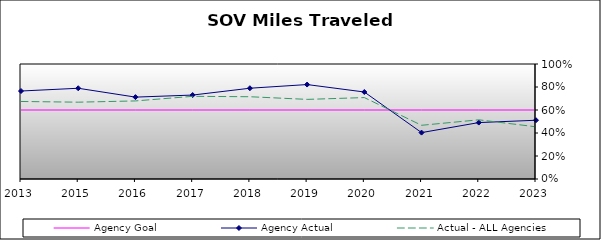
| Category | Agency Goal | Agency Actual | Actual - ALL Agencies |
|---|---|---|---|
| 2013.0 | 0.6 | 0.765 | 0.674 |
| 2015.0 | 0.6 | 0.789 | 0.668 |
| 2016.0 | 0.6 | 0.712 | 0.679 |
| 2017.0 | 0.6 | 0.73 | 0.719 |
| 2018.0 | 0.6 | 0.789 | 0.715 |
| 2019.0 | 0.6 | 0.821 | 0.692 |
| 2020.0 | 0.6 | 0.756 | 0.708 |
| 2021.0 | 0.6 | 0.403 | 0.467 |
| 2022.0 | 0.6 | 0.49 | 0.515 |
| 2023.0 | 0.6 | 0.511 | 0.454 |